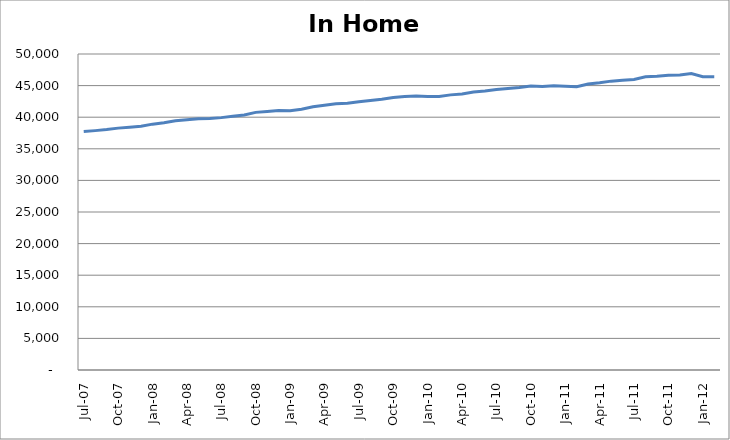
| Category | Series 0 |
|---|---|
| 2007-07-01 | 37743 |
| 2007-08-01 | 37876 |
| 2007-09-01 | 38041 |
| 2007-10-01 | 38271 |
| 2007-11-01 | 38415 |
| 2007-12-01 | 38566 |
| 2008-01-01 | 38902 |
| 2008-02-01 | 39128 |
| 2008-03-01 | 39438 |
| 2008-04-01 | 39611 |
| 2008-05-01 | 39762 |
| 2008-06-01 | 39802 |
| 2008-07-01 | 39932 |
| 2008-08-01 | 40151 |
| 2008-09-01 | 40346 |
| 2008-10-01 | 40764 |
| 2008-11-01 | 40917 |
| 2008-12-01 | 41077 |
| 2009-01-01 | 41012 |
| 2009-02-01 | 41269 |
| 2009-03-01 | 41640 |
| 2009-04-01 | 41894 |
| 2009-05-01 | 42121 |
| 2009-06-01 | 42206 |
| 2009-07-01 | 42439 |
| 2009-08-01 | 42644 |
| 2009-09-01 | 42826 |
| 2009-10-01 | 43118 |
| 2009-11-01 | 43271 |
| 2009-12-01 | 43367 |
| 2010-01-01 | 43262.084 |
| 2010-02-01 | 43281 |
| 2010-03-01 | 43533.083 |
| 2010-04-01 | 43674.083 |
| 2010-05-01 | 43994.083 |
| 2010-06-01 | 44150.084 |
| 2010-07-01 | 44386.084 |
| 2010-08-01 | 44555.084 |
| 2010-09-01 | 44696.084 |
| 2010-10-01 | 44935.083 |
| 2010-11-01 | 44850.082 |
| 2010-12-01 | 44991.162 |
| 2011-01-01 | 44909.241 |
| 2011-02-01 | 44806.316 |
| 2011-03-01 | 45262.394 |
| 2011-04-01 | 45452.57 |
| 2011-05-01 | 45706.965 |
| 2011-06-01 | 45849.561 |
| 2011-07-01 | 45974.673 |
| 2011-08-01 | 46401.6 |
| 2011-09-01 | 46474.48 |
| 2011-10-01 | 46651.436 |
| 2011-11-01 | 46668.773 |
| 2011-12-01 | 46918.74 |
| 2012-01-01 | 46413.774 |
| 2012-02-01 | 46398.131 |